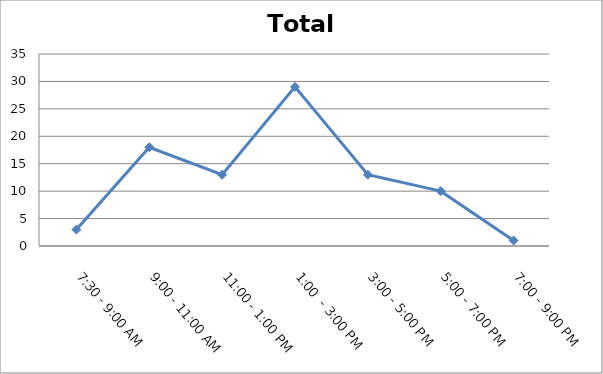
| Category | Total |
|---|---|
| 7:30 - 9:00 AM | 3 |
| 9:00 - 11:00 AM | 18 |
| 11:00 - 1:00 PM | 13 |
| 1:00  - 3:00 PM | 29 |
| 3:00 - 5:00 PM | 13 |
| 5:00 - 7:00 PM | 10 |
| 7:00 - 9:00 PM | 1 |